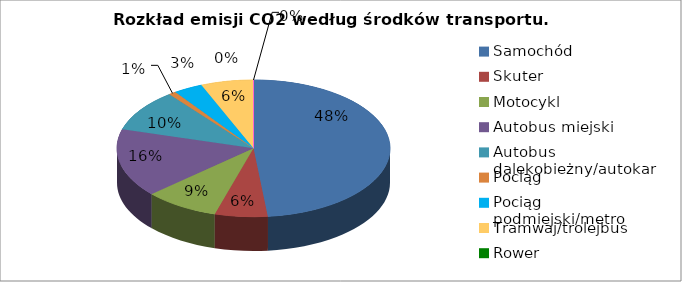
| Category | Series 0 |
|---|---|
| Samochód | 13639.873 |
| Skuter | 1759.782 |
| Motocykl | 2484.397 |
| Autobus miejski | 4545.389 |
| Autobus dalekobieżny/autokar | 2815.962 |
| Pociąg | 246.572 |
| Pociąg podmiejski/metro | 976.013 |
| Tramwaj/trolejbus | 1752.154 |
| Rower | 0 |
| Na piechotę | 0 |